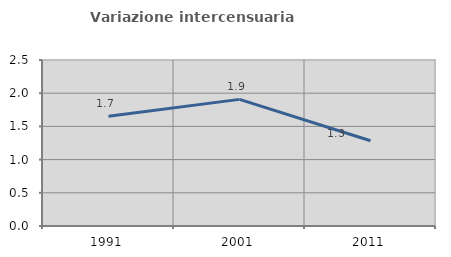
| Category | Variazione intercensuaria annua |
|---|---|
| 1991.0 | 1.654 |
| 2001.0 | 1.907 |
| 2011.0 | 1.284 |